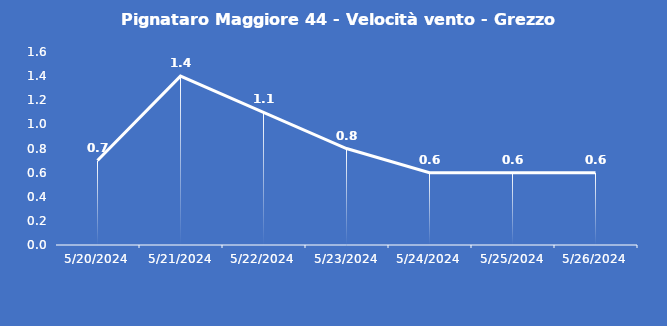
| Category | Pignataro Maggiore 44 - Velocità vento - Grezzo (m/s) |
|---|---|
| 5/20/24 | 0.7 |
| 5/21/24 | 1.4 |
| 5/22/24 | 1.1 |
| 5/23/24 | 0.8 |
| 5/24/24 | 0.6 |
| 5/25/24 | 0.6 |
| 5/26/24 | 0.6 |